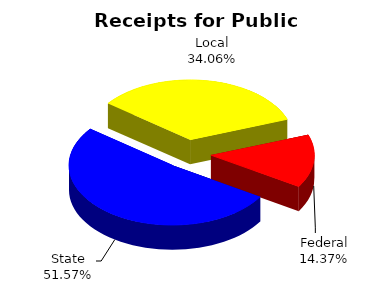
| Category | Series 0 |
|---|---|
| Federal | 0.144 |
| State | 0.516 |
| Local | 0.341 |